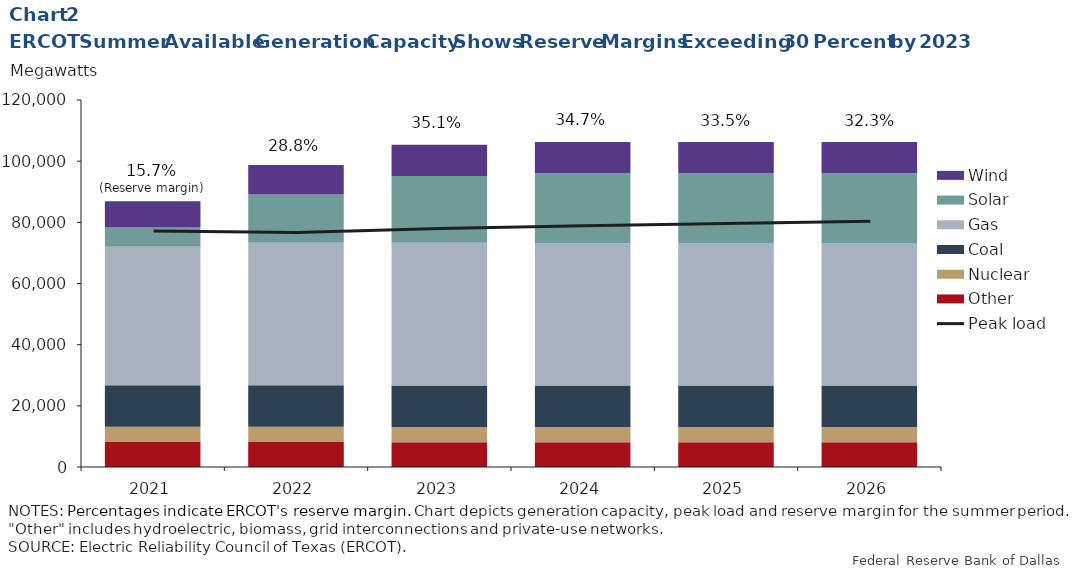
| Category | Other | Nuclear | Coal | Gas | Solar | Wind |
|---|---|---|---|---|---|---|
| 2021.0 | 8209.759 | 4973.2 | 13567.6 | 45289.3 | 6257 | 8566 |
| 2022.0 | 8180.641 | 4973.2 | 13567.6 | 46615.7 | 15744.88 | 9640.009 |
| 2023.0 | 8130.472 | 4973.2 | 13567.6 | 46615.7 | 21847.44 | 10264.552 |
| 2024.0 | 8083.472 | 4973.2 | 13567.6 | 46615.7 | 22791.36 | 10264.552 |
| 2025.0 | 8086.472 | 4973.2 | 13567.6 | 46615.7 | 22791.36 | 10264.552 |
| 2026.0 | 8089.472 | 4973.2 | 13567.6 | 46615.7 | 22791.36 | 10264.552 |